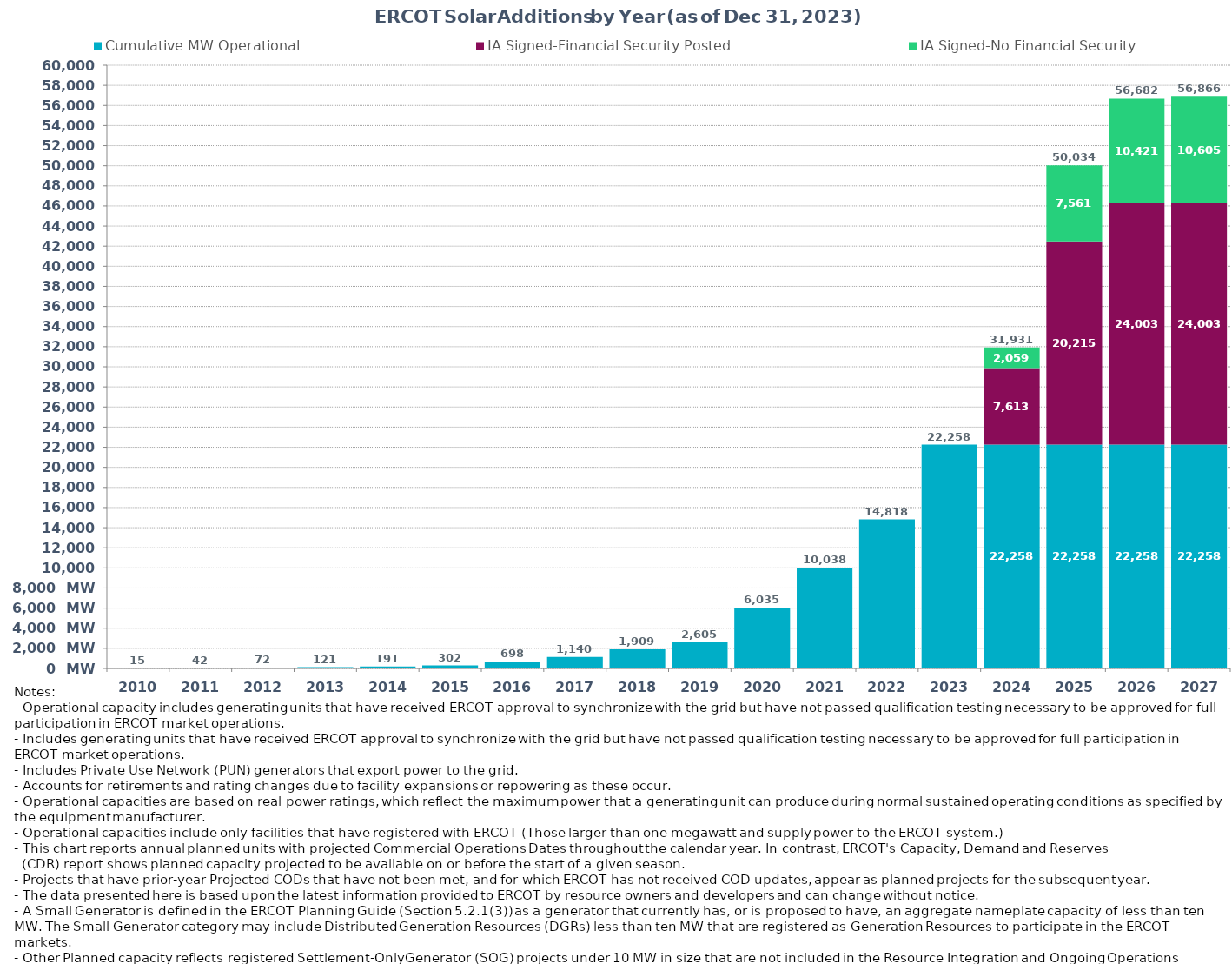
| Category | Cumulative MW Operational | IA Signed-Financial Security Posted  | IA Signed-No Financial Security  | Other Planned | Cumulative Installed and Planned |
|---|---|---|---|---|---|
| 2010.0 | 14.9 | 0 | 0 | 0 | 14.9 |
| 2011.0 | 41.6 | 0 | 0 | 0 | 41.6 |
| 2012.0 | 72 | 0 | 0 | 0 | 72 |
| 2013.0 | 121.18 | 0 | 0 | 0 | 121.18 |
| 2014.0 | 190.7 | 0 | 0 | 0 | 190.7 |
| 2015.0 | 301.71 | 0 | 0 | 0 | 301.71 |
| 2016.0 | 698.22 | 0 | 0 | 0 | 698.22 |
| 2017.0 | 1140.12 | 0 | 0 | 0 | 1140.12 |
| 2018.0 | 1909.16 | 0 | 0 | 0 | 1909.16 |
| 2019.0 | 2605.35 | 0 | 0 | 0 | 2605.35 |
| 2020.0 | 6034.64 | 0 | 0 | 0 | 6034.64 |
| 2021.0 | 10038.12 | 0 | 0 | 0 | 10038.12 |
| 2022.0 | 14818.22 | 0 | 0 | 0 | 14818.22 |
| 2023.0 | 22258.18 | 0 | 0 | 0 | 22258.18 |
| 2024.0 | 22258.18 | 7613.34 | 2059.01 | 0 | 31930.53 |
| 2025.0 | 22258.18 | 20214.98 | 7561.3 | 0 | 50034.46 |
| 2026.0 | 22258.18 | 24003.29 | 10420.61 | 0 | 56682.08 |
| 2027.0 | 22258.18 | 24003.29 | 10604.61 | 0 | 56866.08 |